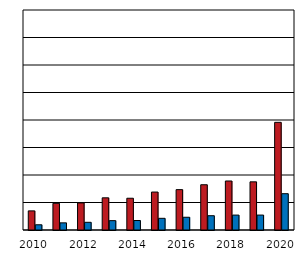
| Category | ženy  Women | muži  Men |
|---|---|---|
| 2010.0 | 13.9 | 3.8 |
| 2011.0 | 19.4 | 5.2 |
| 2012.0 | 19.7 | 5.6 |
| 2013.0 | 23.4 | 6.8 |
| 2014.0 | 23.1 | 6.9 |
| 2015.0 | 27.6 | 8.5 |
| 2016.0 | 29.356 | 9.267 |
| 2017.0 | 32.91 | 10.39 |
| 2018.0 | 35.642 | 10.846 |
| 2019.0 | 35.031 | 10.855 |
| 2020.0 | 78.3 | 26.4 |